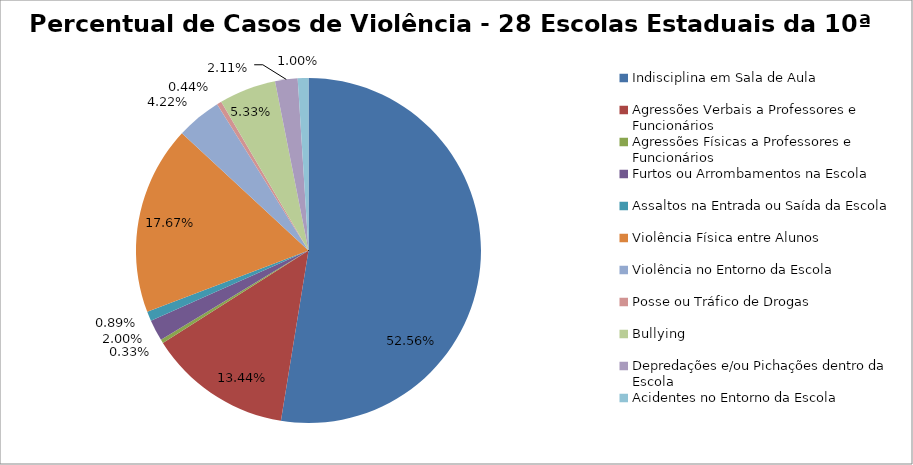
| Category | Percentual |
|---|---|
| Indisciplina em Sala de Aula | 0.526 |
| Agressões Verbais a Professores e Funcionários | 0.134 |
| Agressões Físicas a Professores e Funcionários | 0.003 |
| Furtos ou Arrombamentos na Escola | 0.02 |
| Assaltos na Entrada ou Saída da Escola | 0.009 |
| Violência Física entre Alunos | 0.177 |
| Violência no Entorno da Escola | 0.042 |
| Posse ou Tráfico de Drogas | 0.004 |
| Bullying | 0.053 |
| Depredações e/ou Pichações dentro da Escola | 0.021 |
| Acidentes no Entorno da Escola | 0.01 |